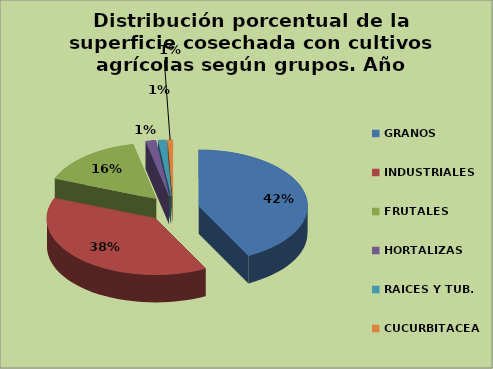
| Category | Series 0 |
|---|---|
| GRANOS  | 89418 |
| INDUSTRIALES  | 81078 |
| FRUTALES  | 33054 |
| HORTALIZAS | 3138 |
| RAICES Y TUB. | 2517 |
| CUCURBITACEA | 1547 |